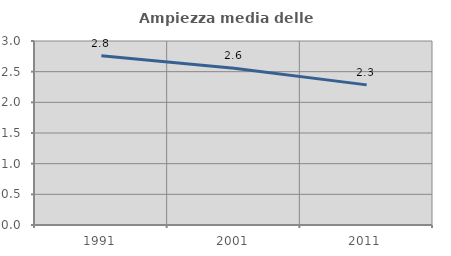
| Category | Ampiezza media delle famiglie |
|---|---|
| 1991.0 | 2.758 |
| 2001.0 | 2.556 |
| 2011.0 | 2.285 |